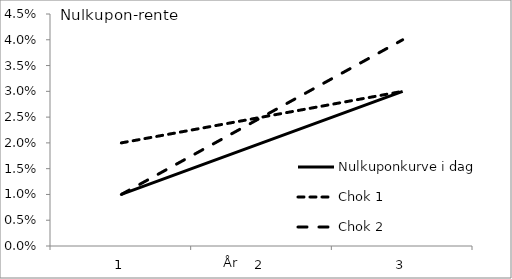
| Category | Nulkuponkurve i dag | Chok 1 | Chok 2 |
|---|---|---|---|
| 0 | 0.01 | 0.02 | 0.01 |
| 1 | 0.02 | 0.025 | 0.025 |
| 2 | 0.03 | 0.03 | 0.04 |